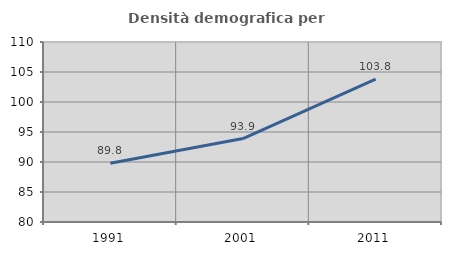
| Category | Densità demografica |
|---|---|
| 1991.0 | 89.775 |
| 2001.0 | 93.913 |
| 2011.0 | 103.812 |